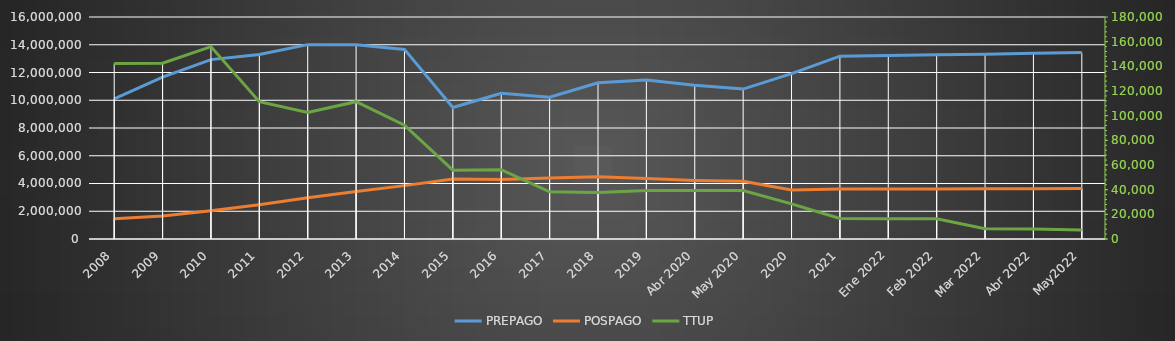
| Category | PREPAGO | POSPAGO |
|---|---|---|
| 2008 | 10097768 | 1452088 |
| 2009 | 11662294 | 1649838 |
| 2010 | 12929040 | 2033814 |
| 2011 | 13295834 | 2467378 |
| 2012 | 14008104 | 2976194 |
| 2013 | 14005126 | 3425277 |
| 2014 | 13666071 | 3846271 |
| 2015 | 9476240 | 4326937 |
| 2016 | 10498467 | 4293426 |
| 2017 | 10219457 | 4393703 |
| 2018 | 11254168 | 4480975 |
| 2019 | 11462048 | 4351686 |
| Abr 2020 | 11073657 | 4217911 |
| May 2020 | 10806656 | 4155948 |
| 2020 | 11917697 | 3539192 |
| 2021 | 13174530 | 3598383 |
| Ene 2022 | 13220510 | 3611202 |
| Feb 2022 | 13277237 | 3612124 |
| Mar 2022 | 13319621 | 3621700 |
| Abr 2022 | 13391496 | 3628201 |
| May2022 | 13434704 | 3642700 |